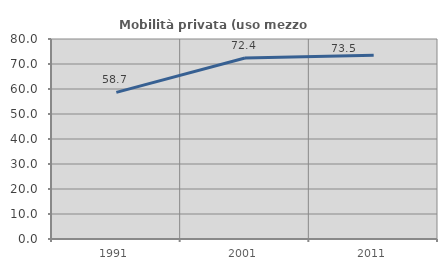
| Category | Mobilità privata (uso mezzo privato) |
|---|---|
| 1991.0 | 58.651 |
| 2001.0 | 72.403 |
| 2011.0 | 73.54 |